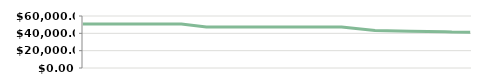
| Category | QUARTER   |
|---|---|
| 2013-04-23 | 50800 |
| 2013-04-25 | 50800 |
| 2013-05-07 | 50800 |
| 2013-05-14 | 50800 |
| 2013-05-14 | 50800 |
| 2013-05-29 | 50800 |
| 2013-06-10 | 50800 |
| 2013-06-21 | 50800 |
| 2013-07-06 | 47400 |
| 2013-08-05 | 47400 |
| 2013-08-19 | 47400 |
| 2013-09-04 | 47400 |
| 2013-09-20 | 47400 |
| 2013-09-25 | 47400 |
| 2013-10-15 | 43258.14 |
| 2013-11-05 | 42312.903 |
| 2013-11-26 | 41811.111 |
| 2013-11-30 | 41500 |
| 2013-12-11 | 41288.235 |